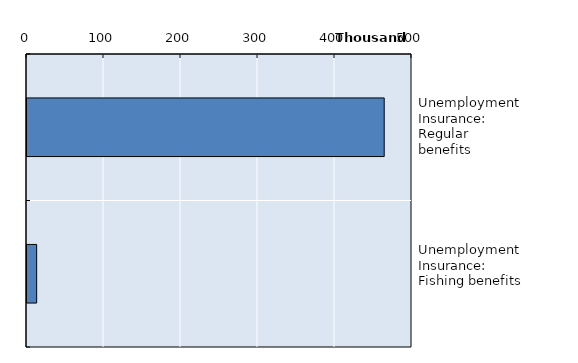
| Category | Series 0 |
|---|---|
| Unemployment Insurance: Regular benefits | 463910 |
| Unemployment Insurance: Fishing benefits | 12542.5 |